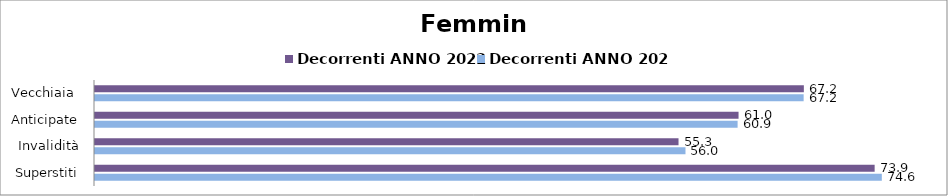
| Category | Decorrenti ANNO 2022 | Decorrenti ANNO 2023 |
|---|---|---|
| Vecchiaia  | 67.19 | 67.17 |
| Anticipate | 61 | 60.91 |
| Invalidità | 55.31 | 55.97 |
| Superstiti | 73.9 | 74.58 |